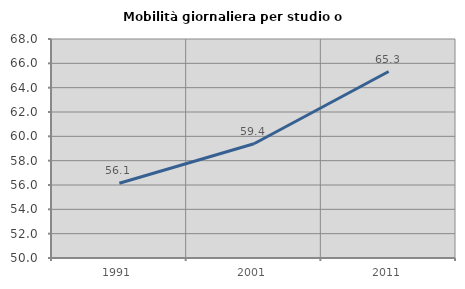
| Category | Mobilità giornaliera per studio o lavoro |
|---|---|
| 1991.0 | 56.148 |
| 2001.0 | 59.387 |
| 2011.0 | 65.328 |